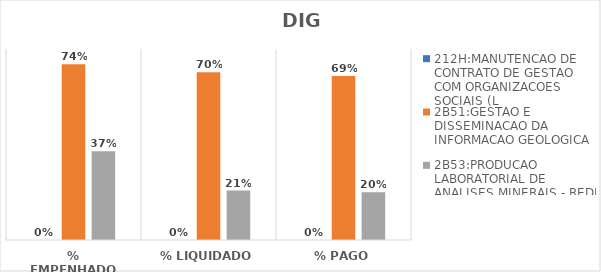
| Category | 212H:MANUTENCAO DE CONTRATO DE GESTAO COM ORGANIZACOES SOCIAIS (L | 2B51:GESTAO E DISSEMINACAO DA INFORMACAO GEOLOGICA | 2B53:PRODUCAO LABORATORIAL DE ANALISES MINERAIS - REDE LAMIN |
|---|---|---|---|
| % EMPENHADO | 0 | 0.736 | 0.372 |
| % LIQUIDADO | 0 | 0.702 | 0.207 |
| % PAGO | 0 | 0.687 | 0.2 |